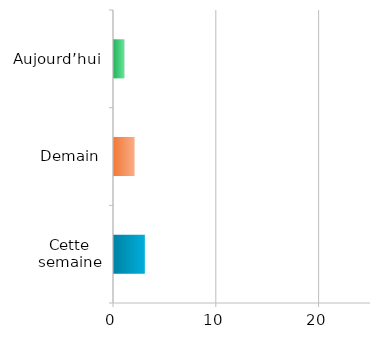
| Category | Series 0 |
|---|---|
| Cette semaine | 3 |
| Demain | 2 |
| Aujourd’hui | 1 |